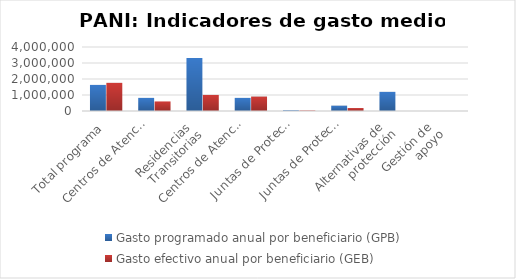
| Category | Gasto programado anual por beneficiario (GPB)  | Gasto efectivo anual por beneficiario (GEB)  |
|---|---|---|
| Total programa | 1630594.779 | 1759318.953 |
| Centros de Atención Infantil-
Guarderías | 819565.345 | 597650.893 |
| Residencias 
Transitorias | 3306958.843 | 1003774.864 |
| Centros de Atención Infantil-
Guarderías Red de Cuido Directo | 819566.543 | 901095.276 |
| Juntas de Protección de Niñez y 
Adolescencia-Promoción | 47487.852 | 32280.672 |
| Juntas de Protección de Niñez y
 Adolescencia-Prevención | 332768 | 185497.562 |
| Alternativas de 
protección | 1196327.771 | 0 |
| Gestión de 
apoyo | 0 | 0 |